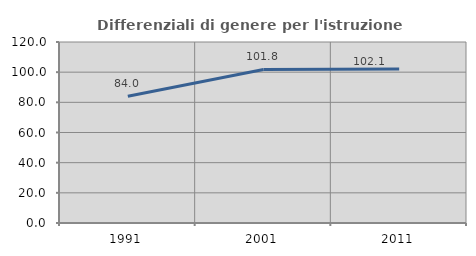
| Category | Differenziali di genere per l'istruzione superiore |
|---|---|
| 1991.0 | 84.029 |
| 2001.0 | 101.818 |
| 2011.0 | 102.142 |